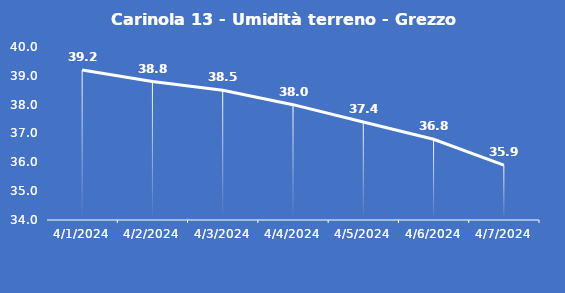
| Category | Carinola 13 - Umidità terreno - Grezzo (%VWC) |
|---|---|
| 4/1/24 | 39.2 |
| 4/2/24 | 38.8 |
| 4/3/24 | 38.5 |
| 4/4/24 | 38 |
| 4/5/24 | 37.4 |
| 4/6/24 | 36.8 |
| 4/7/24 | 35.9 |